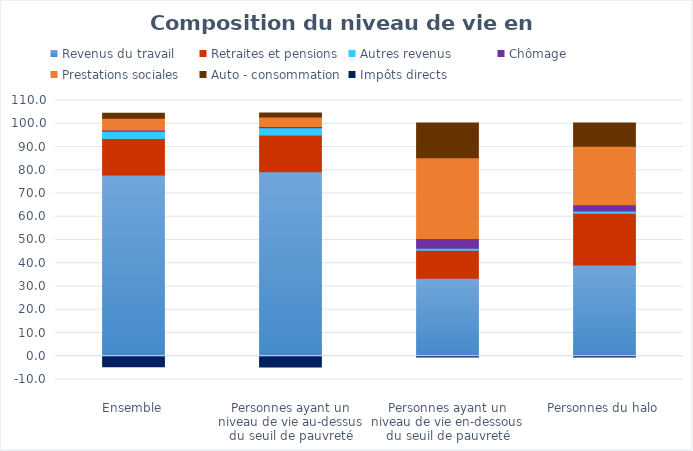
| Category | Revenus du travail | Retraites et pensions | Autres revenus | Chômage | Prestations sociales | Auto - consommation | Impôts directs |
|---|---|---|---|---|---|---|---|
| Ensemble | 77.928 | 15.706 | 3.093 | 0.622 | 4.978 | 2.159 | -4.485 |
| Personnes ayant un niveau de vie au-dessus du seuil de pauvreté | 79.322 | 15.822 | 3.161 | 0.509 | 4.044 | 1.758 | -4.615 |
| Personnes ayant un niveau de vie en-dessous du seuil de pauvreté | 33.53 | 12.02 | 0.932 | 4.21 | 34.726 | 14.924 | -0.342 |
| Personnes du halo | 39.23 | 22.284 | 0.942 | 2.679 | 25.215 | 9.935 | -0.287 |